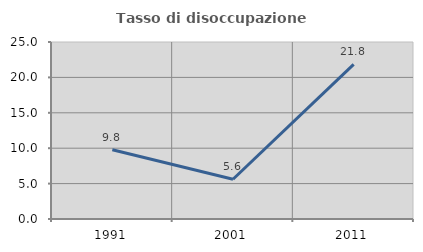
| Category | Tasso di disoccupazione giovanile  |
|---|---|
| 1991.0 | 9.777 |
| 2001.0 | 5.616 |
| 2011.0 | 21.849 |